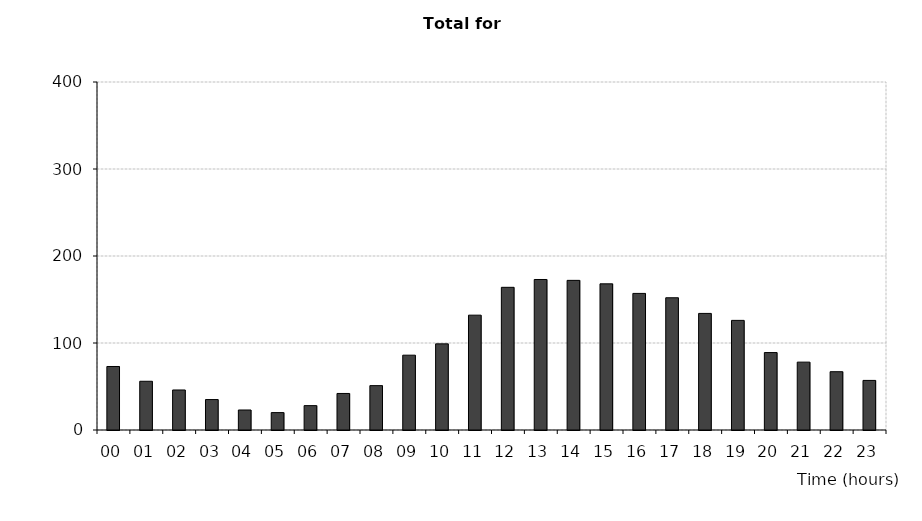
| Category | All severities |
|---|---|
| 00 | 73 |
| 01 | 56 |
| 02 | 46 |
| 03 | 35 |
| 04 | 23 |
| 05 | 20 |
| 06 | 28 |
| 07 | 42 |
| 08 | 51 |
| 09 | 86 |
| 10 | 99 |
| 11 | 132 |
| 12 | 164 |
| 13 | 173 |
| 14 | 172 |
| 15 | 168 |
| 16 | 157 |
| 17 | 152 |
| 18 | 134 |
| 19 | 126 |
| 20 | 89 |
| 21 | 78 |
| 22 | 67 |
| 23 | 57 |